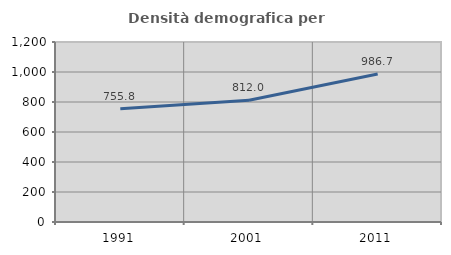
| Category | Densità demografica |
|---|---|
| 1991.0 | 755.804 |
| 2001.0 | 812.034 |
| 2011.0 | 986.688 |